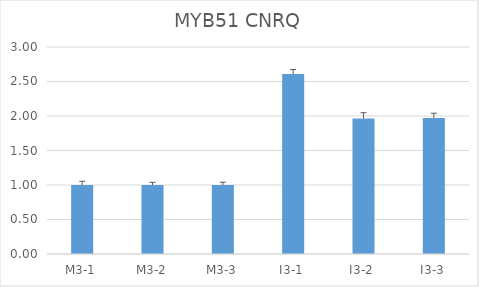
| Category | MYB51 CNRQ |
|---|---|
| M3-1 | 1 |
| M3-2 | 1 |
| M3-3 | 1 |
| I3-1 | 2.607 |
| I3-2 | 1.964 |
| I3-3 | 1.97 |